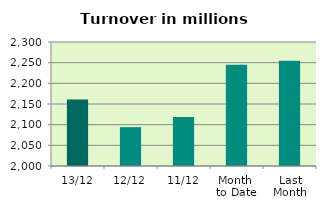
| Category | Series 0 |
|---|---|
| 13/12 | 2161.086 |
| 12/12 | 2093.966 |
| 11/12 | 2118.536 |
| Month 
to Date | 2244.673 |
| Last
Month | 2254.707 |